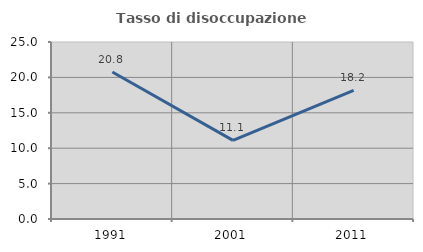
| Category | Tasso di disoccupazione giovanile  |
|---|---|
| 1991.0 | 20.755 |
| 2001.0 | 11.111 |
| 2011.0 | 18.182 |